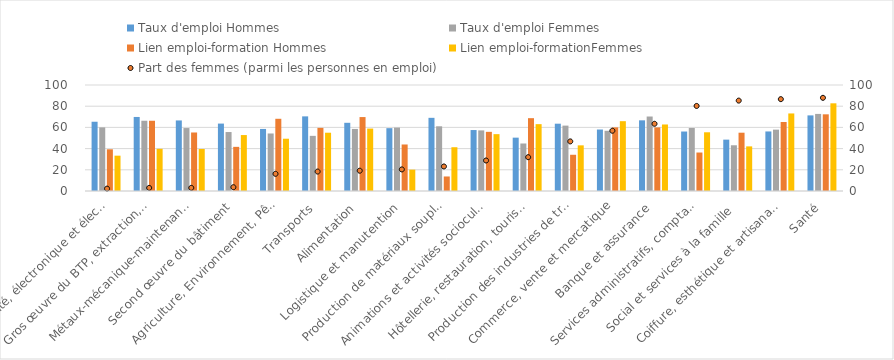
| Category | Taux d'emploi Hommes  | Taux d'emploi Femmes | Lien emploi-formation Hommes | Lien emploi-formationFemmes |
|---|---|---|---|---|
| Électricité, électronique et électrotechnique | 65.34 | 60 | 39.36 | 33.33 |
| Gros œuvre du BTP, extraction, conception et conduite de travaux | 69.85 | 66.29 | 66.27 | 39.81 |
| Métaux-mécanique-maintenance | 66.57 | 59.38 | 55.2 | 39.66 |
| Second œuvre du bâtiment | 63.6 | 55.63 | 41.65 | 52.78 |
| Agriculture, Environnement, Pêche, Aquaculture | 58.54 | 54.26 | 68.13 | 49.32 |
| Transports | 70.41 | 52.03 | 59.57 | 54.98 |
| Alimentation | 64.34 | 58.56 | 69.75 | 58.89 |
| Logistique et manutention | 59.28 | 59.82 | 43.88 | 20.16 |
| Production de matériaux souples, bois, papier et carton | 69.03 | 61.04 | 13.7 | 41.3 |
| Animations et activités socioculturelles et sportives | 57.51 | 57.17 | 55.81 | 53.64 |
| Hôtellerie, restauration, tourisme | 50.33 | 44.82 | 68.71 | 63.07 |
| Production des industries de transformation | 63.5 | 61.69 | 34.18 | 43.07 |
| Commerce, vente et mercatique | 58 | 56.8 | 60.04 | 65.87 |
| Banque et assurance | 66.67 | 70.27 | 60 | 62.76 |
| Services administratifs, comptables et ressources humaines | 56.11 | 59.47 | 36.3 | 55.4 |
| Social et services à la famille | 48.46 | 43.14 | 55 | 42.09 |
| Coiffure, esthétique et artisanat d'art | 56.18 | 57.89 | 65.12 | 73.16 |
| Santé | 71.33 | 72.72 | 72.34 | 82.73 |